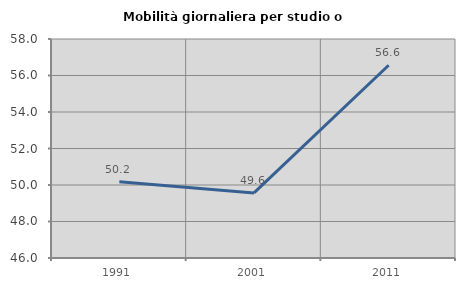
| Category | Mobilità giornaliera per studio o lavoro |
|---|---|
| 1991.0 | 50.181 |
| 2001.0 | 49.565 |
| 2011.0 | 56.561 |